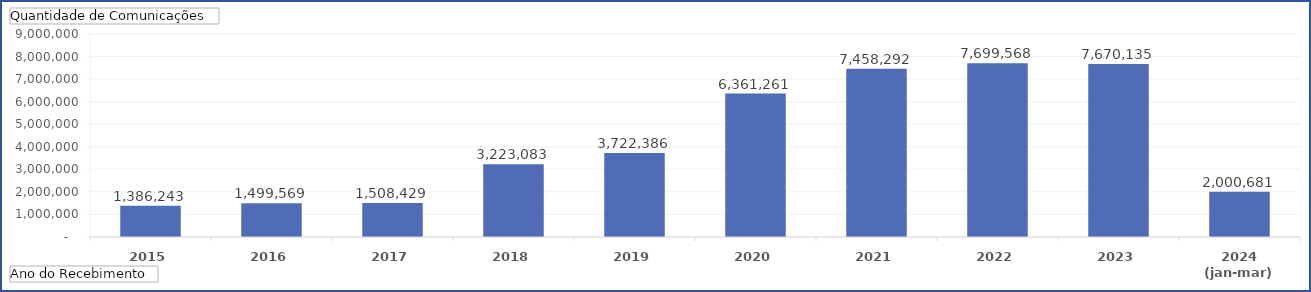
| Category | Total |
|---|---|
| 2015 | 1386243 |
| 2016 | 1499569 |
| 2017 | 1508429 |
| 2018 | 3223083 |
| 2019 | 3722386 |
| 2020 | 6361261 |
| 2021 | 7458292 |
| 2022 | 7699568 |
| 2023 | 7670135 |
| 2024 (jan-mar) | 2000681 |